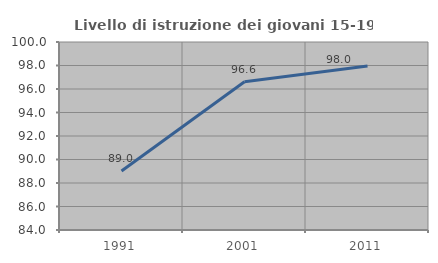
| Category | Livello di istruzione dei giovani 15-19 anni |
|---|---|
| 1991.0 | 89.024 |
| 2001.0 | 96.61 |
| 2011.0 | 97.953 |